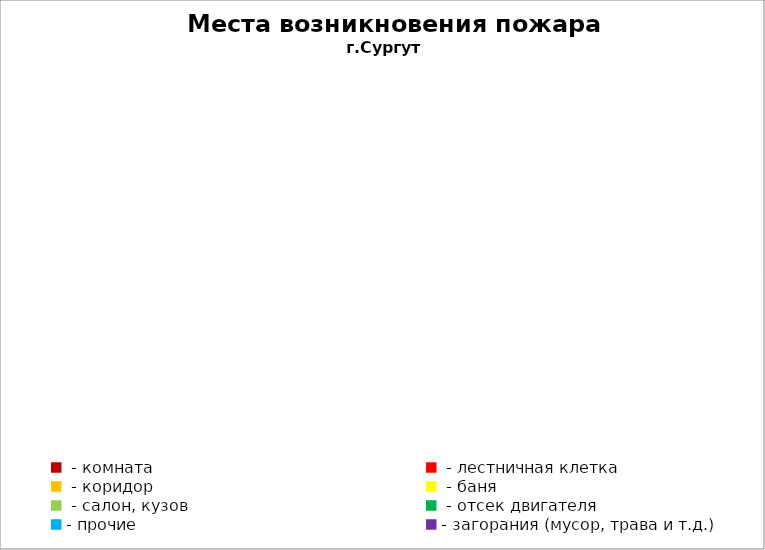
| Category | Места возникновения пожара |
|---|---|
|  - комната | 42 |
|  - лестничная клетка | 11 |
|  - коридор | 6 |
|  - баня | 15 |
|  - салон, кузов | 5 |
|  - отсек двигателя | 12 |
| - прочие | 59 |
| - загорания (мусор, трава и т.д.)  | 108 |